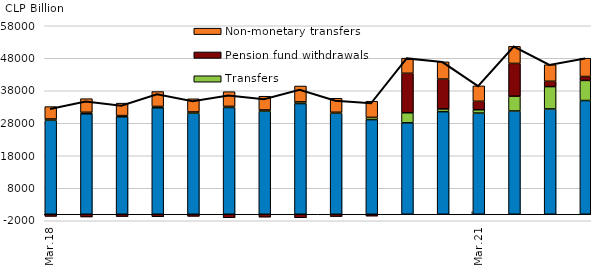
| Category | Labour/other household income | Transfers | Pension fund withdrawals | Non-monetary transfers |
|---|---|---|---|---|
| 2018-03-01 | 28910.989 | 394.097 | -652.071 | 3824.284 |
| 2018-06-01 | 30914.582 | 476.325 | -831.907 | 4170.311 |
| 2018-09-01 | 29978.45 | 383.916 | -702.048 | 3827.123 |
| 2018-12-01 | 32753.744 | 415.684 | -761.741 | 4587.724 |
| 2019-03-01 | 31090.619 | 390.132 | -640.159 | 4044.434 |
| 2019-06-01 | 32850.353 | 345.97 | -1076.674 | 4513.811 |
| 2019-09-01 | 31734.644 | 356.66 | -877.802 | 4229.679 |
| 2019-12-01 | 34049.436 | 526.857 | -1070.795 | 4882.341 |
| 2020-03-01 | 31062.437 | 325.487 | -702.248 | 4292.941 |
| 2020-06-01 | 29119.128 | 689.602 | -562.841 | 4973.395 |
| 2020-09-01 | 28131.242 | 3098.725 | 12149.424 | 4653.322 |
| 2020-12-01 | 31561.642 | 852.34 | 9183.565 | 5301.544 |
| 2021-03-01 | 31130.711 | 1019.967 | 2604.22 | 4742.136 |
| 2021-06-01 | 31778.403 | 4556.776 | 10081.56 | 5253.75 |
| 2021-09-01 | 32405.3 | 6873.02 | 1638.85 | 5087.824 |
| 2021-12-01 | 34991.511 | 6185.164 | 1204.714 | 5634.254 |